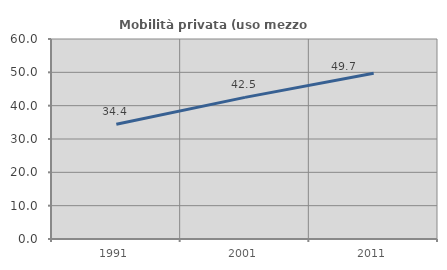
| Category | Mobilità privata (uso mezzo privato) |
|---|---|
| 1991.0 | 34.448 |
| 2001.0 | 42.488 |
| 2011.0 | 49.742 |